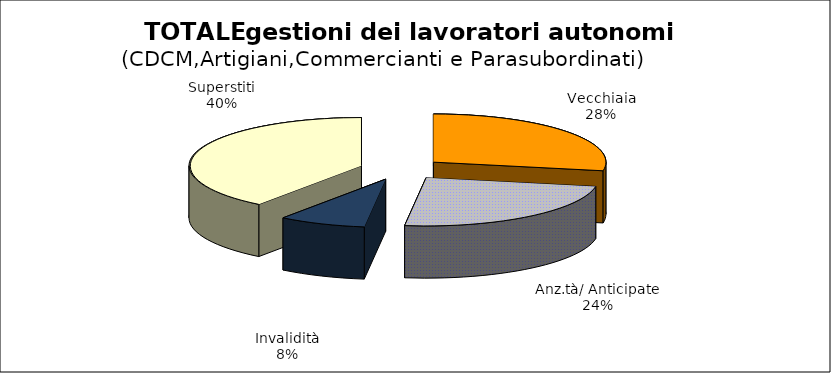
| Category | Series 0 |
|---|---|
| Vecchiaia | 43731 |
| Anz.tà/ Anticipate | 37848 |
| Invalidità | 12817 |
| Superstiti | 62539 |